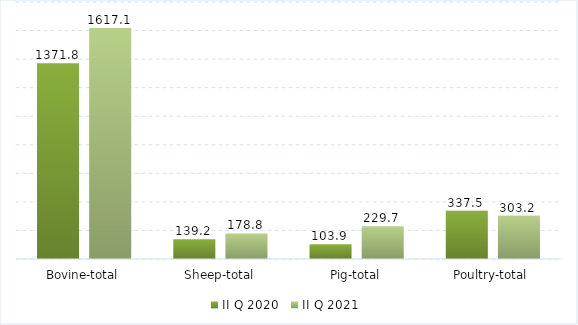
| Category | II Q 2020 | II Q 2021 |
|---|---|---|
| Bovine-total | 1371.8 | 1617.113 |
| Sheep-total | 139.2 | 178.8 |
| Pig-total | 103.9 | 229.661 |
| Poultry-total | 337.5 | 303.175 |